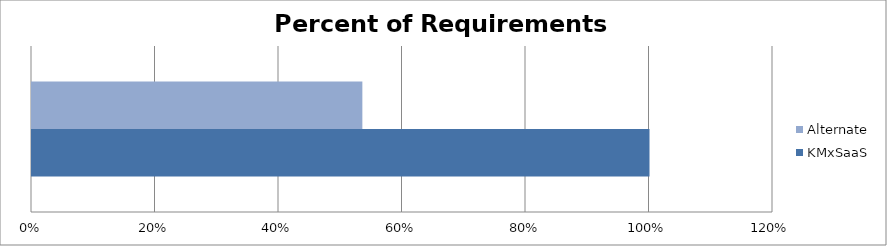
| Category | KMxSaaS | Alternate |
|---|---|---|
| 0 | 1 | 0.535 |